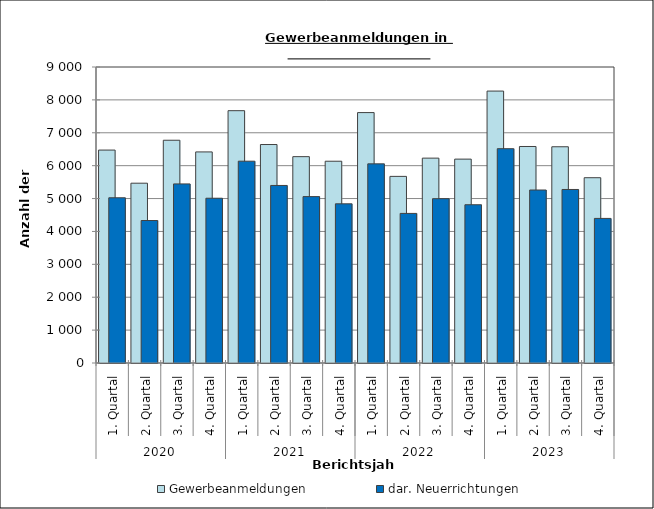
| Category | Gewerbeanmeldungen | dar. Neuerrichtungen |
|---|---|---|
| 0 | 6474 | 5024 |
| 1 | 5467 | 4332 |
| 2 | 6773 | 5445 |
| 3 | 6418 | 5010 |
| 4 | 7672 | 6136 |
| 5 | 6643 | 5398 |
| 6 | 6274 | 5059 |
| 7 | 6135 | 4840 |
| 8 | 7614 | 6055 |
| 9 | 5674 | 4548 |
| 10 | 6229 | 4996 |
| 11 | 6199 | 4812 |
| 12 | 8268 | 6516 |
| 13 | 6583 | 5260 |
| 14 | 6575 | 5276 |
| 15 | 5634 | 4396 |